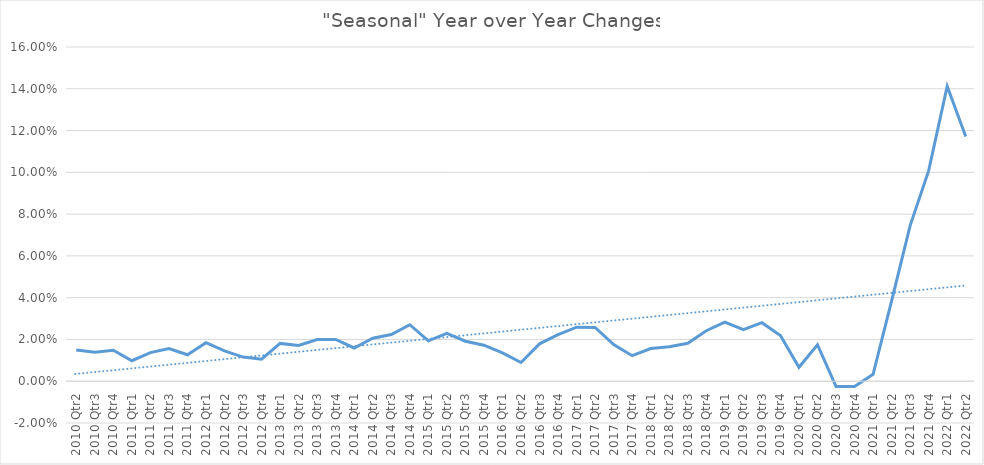
| Category | "Seasonal" Year over Year Changes |
|---|---|
| 2010 Qtr2 | 0.015 |
| 2010 Qtr3 | 0.014 |
| 2010 Qtr4 | 0.015 |
| 2011 Qtr1 | 0.01 |
| 2011 Qtr2 | 0.014 |
| 2011 Qtr3 | 0.016 |
| 2011 Qtr4 | 0.013 |
| 2012 Qtr1 | 0.018 |
| 2012 Qtr2 | 0.014 |
| 2012 Qtr3 | 0.012 |
| 2012 Qtr4 | 0.011 |
| 2013 Qtr1 | 0.018 |
| 2013 Qtr2 | 0.017 |
| 2013 Qtr3 | 0.02 |
| 2013 Qtr4 | 0.02 |
| 2014 Qtr1 | 0.016 |
| 2014 Qtr2 | 0.021 |
| 2014 Qtr3 | 0.022 |
| 2014 Qtr4 | 0.027 |
| 2015 Qtr1 | 0.019 |
| 2015 Qtr2 | 0.023 |
| 2015 Qtr3 | 0.019 |
| 2015 Qtr4 | 0.017 |
| 2016 Qtr1 | 0.014 |
| 2016 Qtr2 | 0.009 |
| 2016 Qtr3 | 0.018 |
| 2016 Qtr4 | 0.022 |
| 2017 Qtr1 | 0.026 |
| 2017 Qtr2 | 0.026 |
| 2017 Qtr3 | 0.018 |
| 2017 Qtr4 | 0.012 |
| 2018 Qtr1 | 0.016 |
| 2018 Qtr2 | 0.016 |
| 2018 Qtr3 | 0.018 |
| 2018 Qtr4 | 0.024 |
| 2019 Qtr1 | 0.028 |
| 2019 Qtr2 | 0.025 |
| 2019 Qtr3 | 0.028 |
| 2019 Qtr4 | 0.022 |
| 2020 Qtr1 | 0.007 |
| 2020 Qtr2 | 0.017 |
| 2020 Qtr3 | -0.002 |
| 2020 Qtr4 | -0.002 |
| 2021 Qtr1 | 0.003 |
| 2021 Qtr2 | 0.038 |
| 2021 Qtr3 | 0.075 |
| 2021 Qtr4 | 0.101 |
| 2022 Qtr1 | 0.141 |
| 2022 Qtr2 | 0.117 |